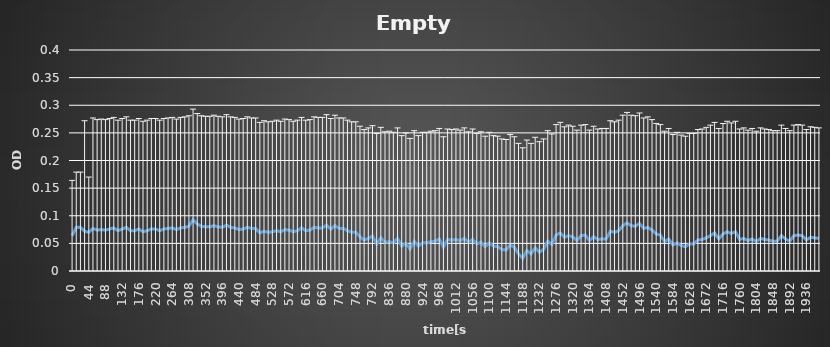
| Category | Empty |
|---|---|
| 0.0 | 0.064 |
| 11.0 | 0.079 |
| 22.0 | 0.079 |
| 33.0 | 0.072 |
| 44.0 | 0.07 |
| 55.0 | 0.077 |
| 66.0 | 0.074 |
| 77.0 | 0.075 |
| 88.0 | 0.074 |
| 99.0 | 0.076 |
| 110.0 | 0.078 |
| 121.0 | 0.073 |
| 132.0 | 0.076 |
| 143.0 | 0.079 |
| 154.0 | 0.073 |
| 165.0 | 0.073 |
| 176.0 | 0.076 |
| 187.0 | 0.071 |
| 198.0 | 0.073 |
| 209.0 | 0.076 |
| 220.0 | 0.076 |
| 231.0 | 0.073 |
| 242.0 | 0.076 |
| 253.0 | 0.077 |
| 264.0 | 0.078 |
| 275.0 | 0.075 |
| 286.0 | 0.078 |
| 297.0 | 0.079 |
| 308.0 | 0.081 |
| 319.0 | 0.093 |
| 330.0 | 0.085 |
| 341.0 | 0.081 |
| 352.0 | 0.08 |
| 363.0 | 0.08 |
| 374.0 | 0.082 |
| 385.0 | 0.08 |
| 396.0 | 0.079 |
| 407.0 | 0.083 |
| 418.0 | 0.079 |
| 429.0 | 0.078 |
| 440.0 | 0.075 |
| 451.0 | 0.076 |
| 462.0 | 0.079 |
| 473.0 | 0.077 |
| 484.0 | 0.077 |
| 495.0 | 0.069 |
| 506.0 | 0.072 |
| 517.0 | 0.07 |
| 528.0 | 0.071 |
| 539.0 | 0.073 |
| 550.0 | 0.071 |
| 561.0 | 0.075 |
| 572.0 | 0.074 |
| 583.0 | 0.071 |
| 594.0 | 0.073 |
| 605.0 | 0.078 |
| 616.0 | 0.073 |
| 627.0 | 0.074 |
| 638.0 | 0.079 |
| 649.0 | 0.078 |
| 660.0 | 0.078 |
| 671.0 | 0.083 |
| 682.0 | 0.076 |
| 693.0 | 0.082 |
| 704.0 | 0.077 |
| 715.0 | 0.077 |
| 726.0 | 0.073 |
| 737.0 | 0.07 |
| 748.0 | 0.07 |
| 759.0 | 0.062 |
| 770.0 | 0.056 |
| 781.0 | 0.059 |
| 792.0 | 0.063 |
| 803.0 | 0.049 |
| 814.0 | 0.06 |
| 825.0 | 0.052 |
| 836.0 | 0.053 |
| 847.0 | 0.051 |
| 858.0 | 0.059 |
| 869.0 | 0.045 |
| 880.0 | 0.05 |
| 891.0 | 0.04 |
| 902.0 | 0.054 |
| 913.0 | 0.045 |
| 924.0 | 0.051 |
| 935.0 | 0.051 |
| 946.0 | 0.053 |
| 957.0 | 0.054 |
| 968.0 | 0.058 |
| 979.0 | 0.043 |
| 990.0 | 0.057 |
| 1001.0 | 0.056 |
| 1012.0 | 0.057 |
| 1023.0 | 0.055 |
| 1034.0 | 0.059 |
| 1045.0 | 0.052 |
| 1056.0 | 0.057 |
| 1067.0 | 0.049 |
| 1078.0 | 0.052 |
| 1089.0 | 0.044 |
| 1100.0 | 0.051 |
| 1111.0 | 0.045 |
| 1122.0 | 0.044 |
| 1133.0 | 0.039 |
| 1144.0 | 0.038 |
| 1155.0 | 0.047 |
| 1166.0 | 0.043 |
| 1177.0 | 0.031 |
| 1188.0 | 0.023 |
| 1199.0 | 0.037 |
| 1210.0 | 0.031 |
| 1221.0 | 0.042 |
| 1232.0 | 0.034 |
| 1243.0 | 0.039 |
| 1254.0 | 0.054 |
| 1265.0 | 0.048 |
| 1276.0 | 0.065 |
| 1287.0 | 0.069 |
| 1298.0 | 0.061 |
| 1309.0 | 0.064 |
| 1320.0 | 0.062 |
| 1331.0 | 0.055 |
| 1342.0 | 0.064 |
| 1353.0 | 0.065 |
| 1364.0 | 0.055 |
| 1375.0 | 0.062 |
| 1386.0 | 0.057 |
| 1397.0 | 0.058 |
| 1408.0 | 0.058 |
| 1419.0 | 0.072 |
| 1430.0 | 0.07 |
| 1441.0 | 0.073 |
| 1452.0 | 0.082 |
| 1463.0 | 0.087 |
| 1474.0 | 0.082 |
| 1485.0 | 0.081 |
| 1496.0 | 0.086 |
| 1507.0 | 0.077 |
| 1518.0 | 0.079 |
| 1529.0 | 0.074 |
| 1540.0 | 0.067 |
| 1551.0 | 0.065 |
| 1562.0 | 0.053 |
| 1573.0 | 0.058 |
| 1584.0 | 0.047 |
| 1595.0 | 0.051 |
| 1606.0 | 0.046 |
| 1617.0 | 0.044 |
| 1628.0 | 0.049 |
| 1639.0 | 0.049 |
| 1650.0 | 0.056 |
| 1661.0 | 0.057 |
| 1672.0 | 0.06 |
| 1683.0 | 0.064 |
| 1694.0 | 0.069 |
| 1705.0 | 0.058 |
| 1716.0 | 0.067 |
| 1727.0 | 0.071 |
| 1738.0 | 0.068 |
| 1749.0 | 0.071 |
| 1760.0 | 0.057 |
| 1771.0 | 0.059 |
| 1782.0 | 0.055 |
| 1793.0 | 0.058 |
| 1804.0 | 0.053 |
| 1815.0 | 0.059 |
| 1826.0 | 0.057 |
| 1837.0 | 0.056 |
| 1848.0 | 0.054 |
| 1859.0 | 0.054 |
| 1870.0 | 0.064 |
| 1881.0 | 0.058 |
| 1892.0 | 0.054 |
| 1903.0 | 0.064 |
| 1914.0 | 0.065 |
| 1925.0 | 0.064 |
| 1936.0 | 0.056 |
| 1947.0 | 0.061 |
| 1958.0 | 0.06 |
| 1969.0 | 0.059 |